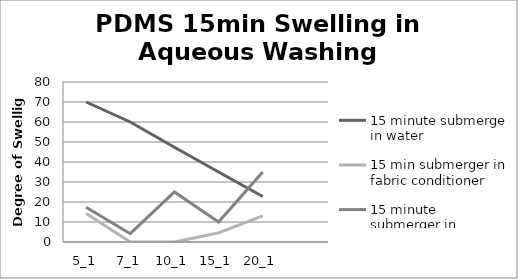
| Category | 15 minute submerge in water | 15 min submerger in fabric conditioner | 15 minute submerger in detergent |
|---|---|---|---|
| 5_1 | 70 | 14.286 | 17.391 |
| 7_1 | 60 | 0 | 4.167 |
| 10_1 | 47.368 | 0 | 25 |
| 15_1 | 35 | 4.545 | 10 |
| 20_1 | 22.727 | 13.043 | 35 |